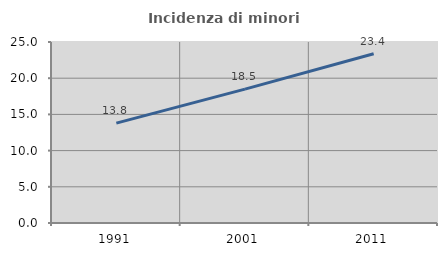
| Category | Incidenza di minori stranieri |
|---|---|
| 1991.0 | 13.793 |
| 2001.0 | 18.493 |
| 2011.0 | 23.386 |